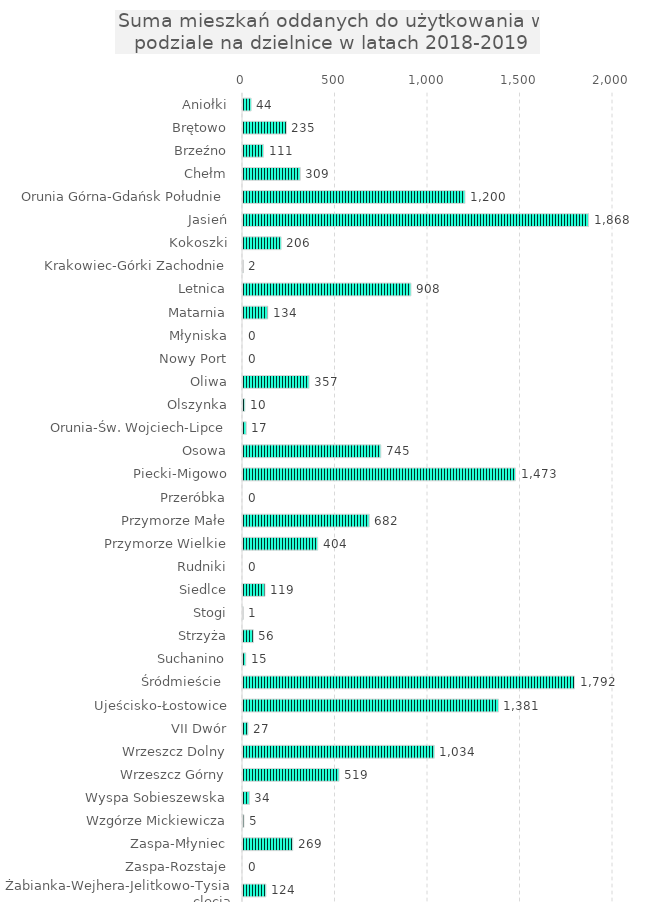
| Category | Series 0 |
|---|---|
| Aniołki | 44 |
| Brętowo | 235 |
| Brzeźno | 111 |
| Chełm | 309 |
| Orunia Górna-Gdańsk Południe | 1200 |
| Jasień | 1868 |
| Kokoszki | 206 |
| Krakowiec-Górki Zachodnie | 2 |
| Letnica | 908 |
| Matarnia | 134 |
| Młyniska | 0 |
| Nowy Port | 0 |
| Oliwa | 357 |
| Olszynka | 10 |
| Orunia-Św. Wojciech-Lipce | 17 |
| Osowa | 745 |
| Piecki-Migowo | 1473 |
| Przeróbka | 0 |
| Przymorze Małe | 682 |
| Przymorze Wielkie | 404 |
| Rudniki | 0 |
| Siedlce | 119 |
| Stogi | 1 |
| Strzyża | 56 |
| Suchanino | 15 |
| Śródmieście  | 1792 |
| Ujeścisko-Łostowice | 1381 |
| VII Dwór | 27 |
| Wrzeszcz Dolny | 1034 |
| Wrzeszcz Górny | 519 |
| Wyspa Sobieszewska | 34 |
| Wzgórze Mickiewicza | 5 |
| Zaspa-Młyniec | 269 |
| Zaspa-Rozstaje | 0 |
| Żabianka-Wejhera-Jelitkowo-Tysiaclecia | 124 |